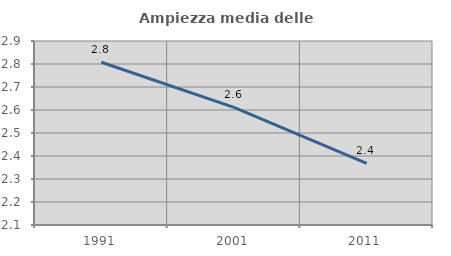
| Category | Ampiezza media delle famiglie |
|---|---|
| 1991.0 | 2.808 |
| 2001.0 | 2.611 |
| 2011.0 | 2.368 |